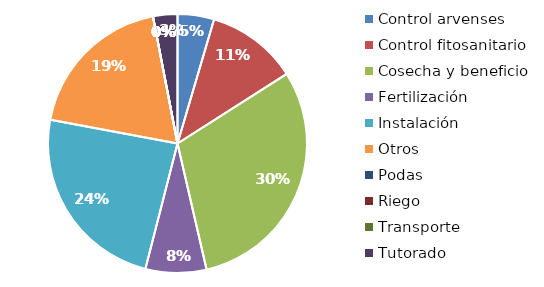
| Category | Valor |
|---|---|
| Control arvenses | 420000 |
| Control fitosanitario | 1050000 |
| Cosecha y beneficio | 2800000 |
| Fertilización | 700000 |
| Instalación | 2205000 |
| Otros | 1750000 |
| Podas | 0 |
| Riego | 0 |
| Transporte | 0 |
| Tutorado | 280000 |